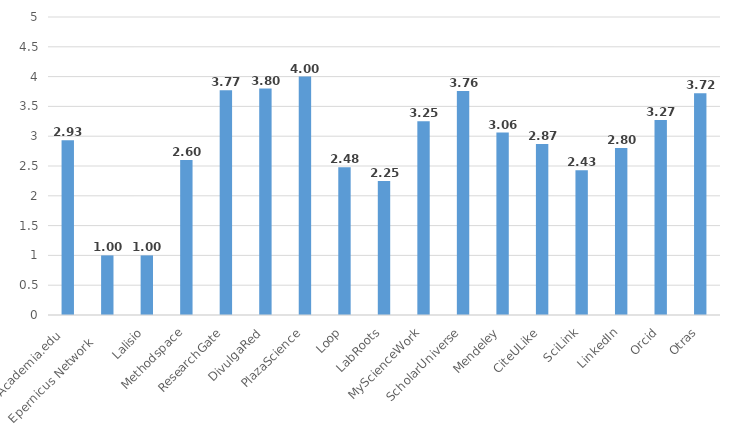
| Category | Series 0 |
|---|---|
| Academia.edu  | 2.93 |
| Epernicus Network     | 1 |
| Lalisio | 1 |
| Methodspace | 2.6 |
| ResearchGate | 3.77 |
| DivulgaRed | 3.8 |
| PlazaScience | 4 |
| Loop | 2.48 |
| LabRoots | 2.25 |
| MyScienceWork | 3.25 |
| ScholarUniverse | 3.76 |
| Mendeley | 3.06 |
| CiteULike | 2.87 |
| SciLink | 2.43 |
| LinkedIn | 2.8 |
| Orcid | 3.27 |
| Otras | 3.72 |